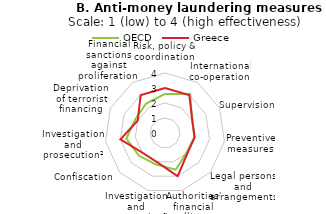
| Category | OECD | Greece |
|---|---|---|
| Risk, policy & coordination  | 2.606 | 3 |
| International co-operation  | 3.091 | 3 |
| Supervision  | 2 | 2 |
| Preventive measures  | 1.97 | 2 |
| Legal persons and arrangements  | 1.939 | 2 |
| Authorities' financial intelligence | 2.545 | 3 |
| Investigation and prosecution¹ | 2.182 | 2 |
| Confiscation  | 2.303 | 2 |
| Investigation and prosecution² | 2.606 | 3 |
| Deprivation of terrorist financing | 2.182 | 2 |
| Financial sanctions against proliferation  | 2.333 | 3 |